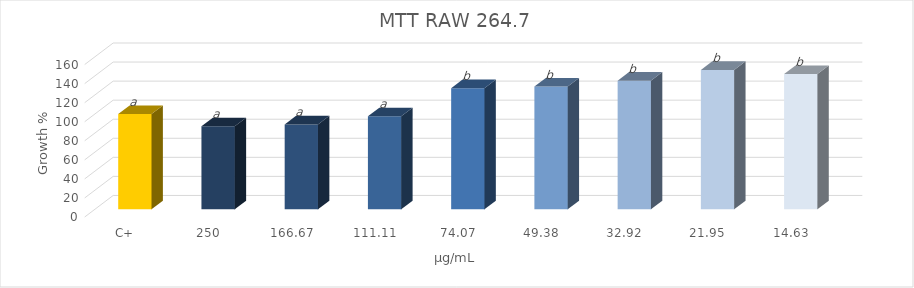
| Category | Series 0 |
|---|---|
| C+ | 100 |
| 250 | 87.145 |
| 166,67 | 89.057 |
| 111,11 | 97.547 |
| 74,07 | 127.097 |
| 49,38 | 128.779 |
| 32,92 | 135 |
| 21,95 | 146.321 |
| 14,63 | 142.001 |